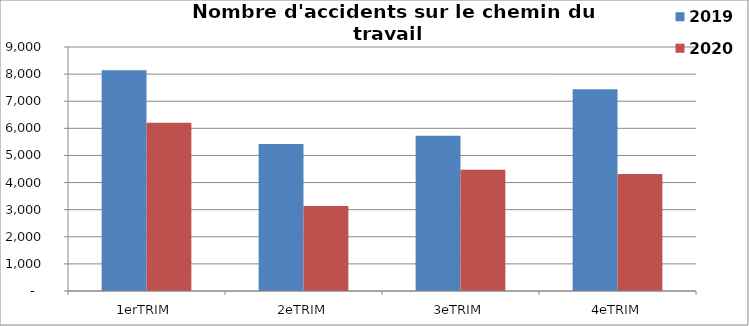
| Category | 2019 | 2020 |
|---|---|---|
| 1erTRIM | 8141 | 6205 |
| 2eTRIM | 5424 | 3136 |
| 3eTRIM | 5729 | 4473 |
| 4eTRIM | 7446 | 4312 |